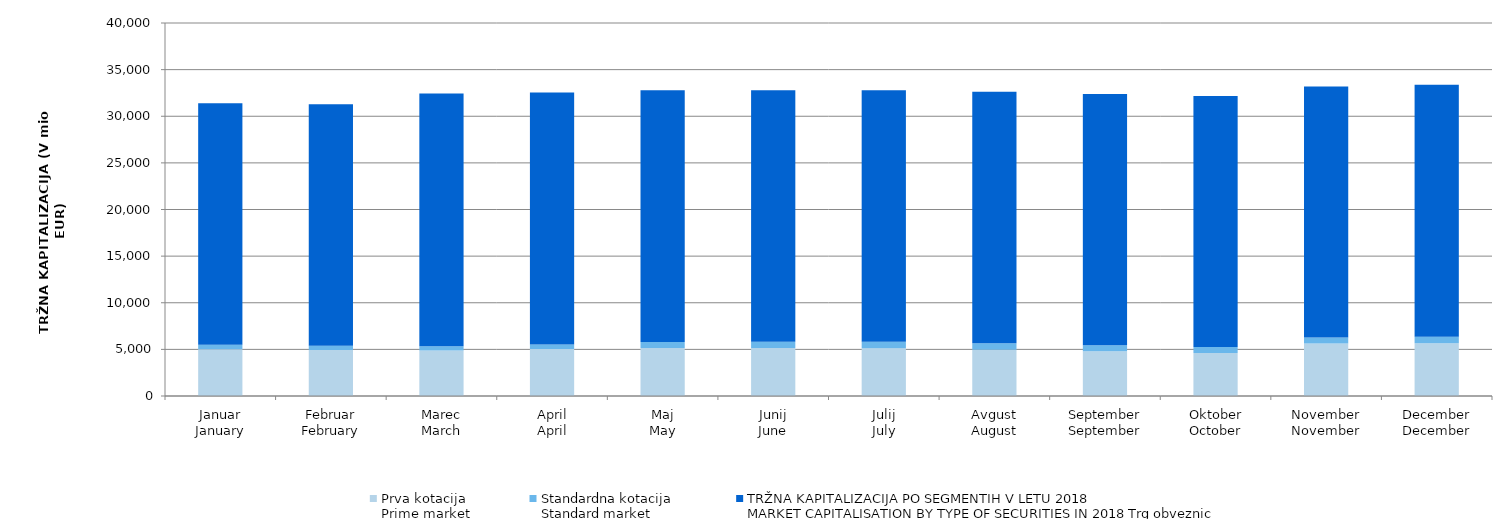
| Category | Prva kotacija
Prime market | Standardna kotacija
Standard market | Series 3 |
|---|---|---|---|
| Januar
January | 5022.792 | 483.67 | 25885.901 |
| Februar
February | 4922.405 | 471.165 | 25899.375 |
| Marec
March | 4884.025 | 463.212 | 27099.633 |
| April
April | 5038.448 | 492.653 | 27015.924 |
| Maj
May | 5153.368 | 630.304 | 27015.655 |
| Junij
June | 5151.963 | 663.065 | 26962.481 |
| Julij
July | 5126.931 | 703.136 | 26961.579 |
| Avgust
August | 4963.893 | 702.004 | 26952.115 |
| September
September | 4788.635 | 655.294 | 26952.079 |
| Oktober
October | 4601.278 | 658.399 | 26904.943 |
| November
November | 5623.421 | 656.539 | 26904.875 |
| December
December | 5667.995 | 680.76 | 27016.888 |